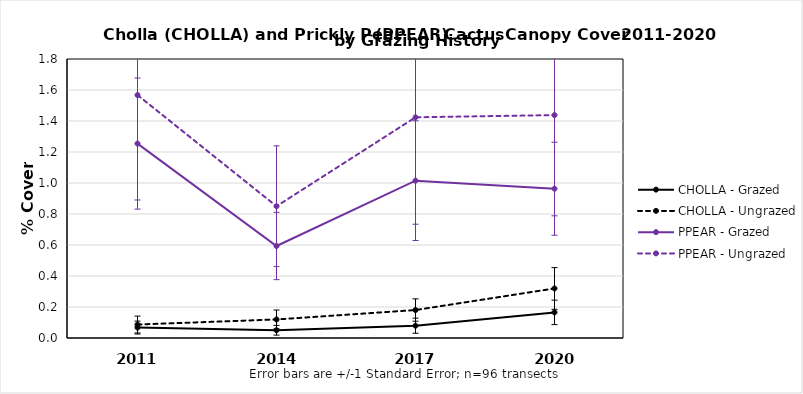
| Category | CHOLLA - Grazed | CHOLLA - Ungrazed | PPEAR - Grazed | PPEAR - Ungrazed |
|---|---|---|---|---|
| 2011.0 | 0.067 | 0.087 | 1.254 | 1.567 |
| 2014.0 | 0.05 | 0.12 | 0.593 | 0.85 |
| 2017.0 | 0.079 | 0.18 | 1.015 | 1.424 |
| 2020.0 | 0.165 | 0.32 | 0.963 | 1.438 |